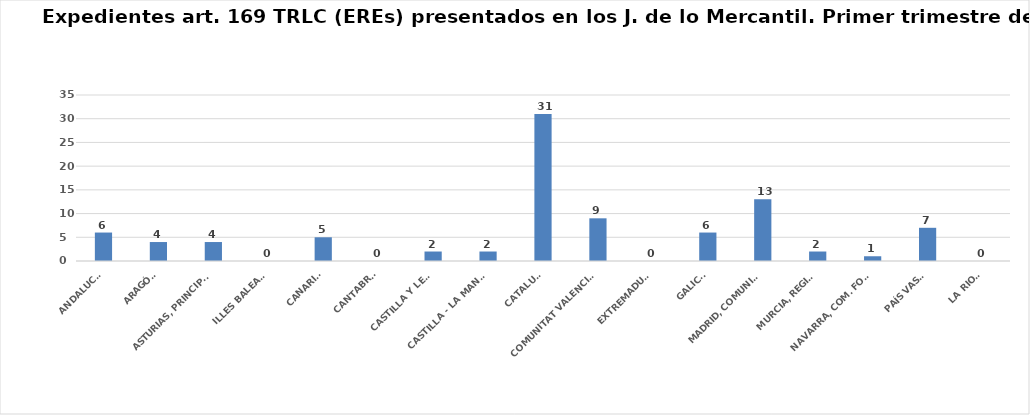
| Category | Series 0 |
|---|---|
| ANDALUCÍA | 6 |
| ARAGÓN | 4 |
| ASTURIAS, PRINCIPADO | 4 |
| ILLES BALEARS | 0 |
| CANARIAS | 5 |
| CANTABRIA | 0 |
| CASTILLA Y LEÓN | 2 |
| CASTILLA - LA MANCHA | 2 |
| CATALUÑA | 31 |
| COMUNITAT VALENCIANA | 9 |
| EXTREMADURA | 0 |
| GALICIA | 6 |
| MADRID, COMUNIDAD | 13 |
| MURCIA, REGIÓN | 2 |
| NAVARRA, COM. FORAL | 1 |
| PAÍS VASCO | 7 |
| LA RIOJA | 0 |